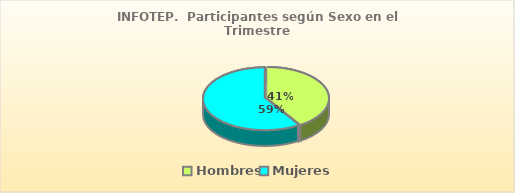
| Category | Series 0 |
|---|---|
| Hombres | 78676 |
| Mujeres | 113146 |